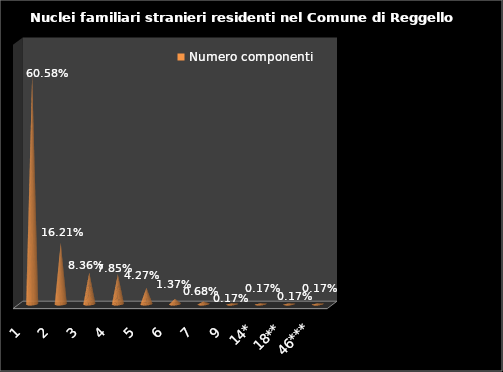
| Category | Numero componenti |
|---|---|
| 1  | 0.606 |
| 2  | 0.162 |
| 3  | 0.084 |
| 4  | 0.078 |
| 5  | 0.043 |
| 6  | 0.014 |
| 7  | 0.007 |
| 9  | 0.002 |
| 14* | 0.002 |
| 18** | 0.002 |
| 46*** | 0.002 |